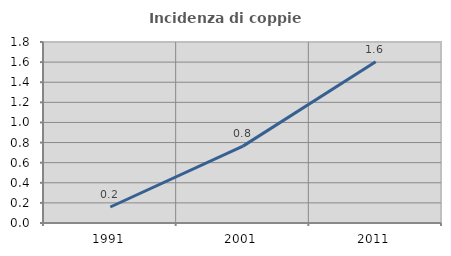
| Category | Incidenza di coppie miste |
|---|---|
| 1991.0 | 0.159 |
| 2001.0 | 0.765 |
| 2011.0 | 1.603 |